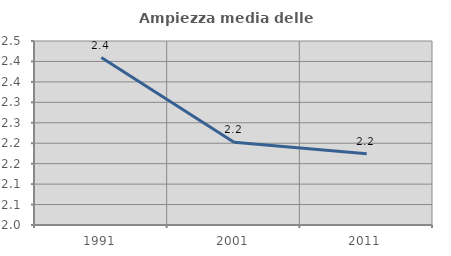
| Category | Ampiezza media delle famiglie |
|---|---|
| 1991.0 | 2.409 |
| 2001.0 | 2.202 |
| 2011.0 | 2.174 |